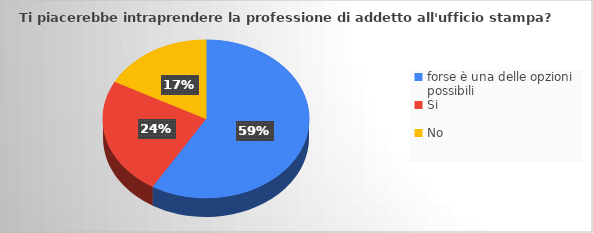
| Category | Series 0 |
|---|---|
| forse è una delle opzioni possibili | 34 |
| Si | 14 |
| No | 10 |